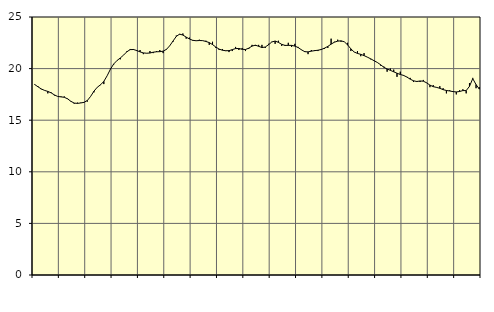
| Category | Piggar | Series 1 |
|---|---|---|
| nan | 18.5 | 18.46 |
| 87.0 | 18.3 | 18.24 |
| 87.0 | 18 | 18.03 |
| 87.0 | 17.9 | 17.89 |
| nan | 17.6 | 17.79 |
| 88.0 | 17.7 | 17.65 |
| 88.0 | 17.4 | 17.45 |
| 88.0 | 17.3 | 17.3 |
| nan | 17.3 | 17.26 |
| 89.0 | 17.3 | 17.22 |
| 89.0 | 17.1 | 17.07 |
| 89.0 | 16.8 | 16.83 |
| nan | 16.6 | 16.66 |
| 90.0 | 16.7 | 16.63 |
| 90.0 | 16.7 | 16.67 |
| 90.0 | 16.7 | 16.73 |
| nan | 16.8 | 16.91 |
| 91.0 | 17.3 | 17.31 |
| 91.0 | 17.7 | 17.81 |
| 91.0 | 18.2 | 18.19 |
| nan | 18.4 | 18.43 |
| 92.0 | 18.5 | 18.76 |
| 92.0 | 19.3 | 19.3 |
| 92.0 | 20 | 19.94 |
| nan | 20.4 | 20.45 |
| 93.0 | 20.8 | 20.78 |
| 93.0 | 20.9 | 21.03 |
| 93.0 | 21.3 | 21.31 |
| nan | 21.7 | 21.63 |
| 94.0 | 21.9 | 21.84 |
| 94.0 | 21.9 | 21.85 |
| 94.0 | 21.7 | 21.75 |
| nan | 21.8 | 21.62 |
| 95.0 | 21.4 | 21.52 |
| 95.0 | 21.5 | 21.49 |
| 95.0 | 21.7 | 21.51 |
| nan | 21.5 | 21.59 |
| 96.0 | 21.7 | 21.63 |
| 96.0 | 21.8 | 21.64 |
| 96.0 | 21.5 | 21.69 |
| nan | 21.9 | 21.86 |
| 97.0 | 22.2 | 22.21 |
| 97.0 | 22.6 | 22.67 |
| 97.0 | 23.2 | 23.12 |
| nan | 23.3 | 23.34 |
| 98.0 | 23.4 | 23.25 |
| 98.0 | 22.9 | 23.05 |
| 98.0 | 23 | 22.87 |
| nan | 22.7 | 22.74 |
| 99.0 | 22.7 | 22.7 |
| 99.0 | 22.8 | 22.72 |
| 99.0 | 22.7 | 22.71 |
| nan | 22.7 | 22.63 |
| 0.0 | 22.3 | 22.52 |
| 0.0 | 22.6 | 22.33 |
| 0.0 | 22 | 22.09 |
| nan | 21.8 | 21.89 |
| 1.0 | 21.9 | 21.78 |
| 1.0 | 21.7 | 21.73 |
| 1.0 | 21.6 | 21.74 |
| nan | 21.7 | 21.84 |
| 2.0 | 22.1 | 21.94 |
| 2.0 | 21.8 | 21.95 |
| 2.0 | 22 | 21.87 |
| nan | 21.7 | 21.85 |
| 3.0 | 21.9 | 21.98 |
| 3.0 | 22.3 | 22.18 |
| 3.0 | 22.2 | 22.27 |
| nan | 22.3 | 22.16 |
| 4.0 | 22.3 | 22.04 |
| 4.0 | 22 | 22.09 |
| 4.0 | 22.4 | 22.31 |
| nan | 22.6 | 22.58 |
| 5.0 | 22.4 | 22.67 |
| 5.0 | 22.7 | 22.54 |
| 5.0 | 22.2 | 22.35 |
| nan | 22.2 | 22.25 |
| 6.0 | 22.5 | 22.25 |
| 6.0 | 22.1 | 22.25 |
| 6.0 | 22.4 | 22.18 |
| nan | 22.1 | 22.04 |
| 7.0 | 21.8 | 21.82 |
| 7.0 | 21.7 | 21.64 |
| 7.0 | 21.4 | 21.62 |
| nan | 21.8 | 21.69 |
| 8.0 | 21.8 | 21.74 |
| 8.0 | 21.7 | 21.78 |
| 8.0 | 21.9 | 21.85 |
| nan | 21.9 | 21.98 |
| 9.0 | 22 | 22.15 |
| 9.0 | 22.9 | 22.37 |
| 9.0 | 22.6 | 22.56 |
| nan | 22.8 | 22.66 |
| 10.0 | 22.6 | 22.69 |
| 10.0 | 22.6 | 22.6 |
| 10.0 | 22.5 | 22.3 |
| nan | 21.7 | 21.91 |
| 11.0 | 21.6 | 21.61 |
| 11.0 | 21.7 | 21.47 |
| 11.0 | 21.2 | 21.38 |
| nan | 21.5 | 21.26 |
| 12.0 | 21.1 | 21.11 |
| 12.0 | 20.9 | 20.95 |
| 12.0 | 20.8 | 20.77 |
| nan | 20.6 | 20.6 |
| 13.0 | 20.3 | 20.38 |
| 13.0 | 20.2 | 20.13 |
| 13.0 | 19.7 | 19.96 |
| nan | 20 | 19.83 |
| 14.0 | 19.9 | 19.69 |
| 14.0 | 19.2 | 19.55 |
| 14.0 | 19.7 | 19.43 |
| nan | 19.3 | 19.34 |
| 15.0 | 19.2 | 19.18 |
| 15.0 | 19.1 | 18.98 |
| 15.0 | 18.7 | 18.82 |
| nan | 18.8 | 18.75 |
| 16.0 | 18.7 | 18.8 |
| 16.0 | 18.9 | 18.78 |
| 16.0 | 18.6 | 18.62 |
| nan | 18.2 | 18.4 |
| 17.0 | 18.4 | 18.25 |
| 17.0 | 18.2 | 18.18 |
| 17.0 | 18.3 | 18.09 |
| nan | 18.1 | 17.96 |
| 18.0 | 17.6 | 17.88 |
| 18.0 | 17.9 | 17.83 |
| 18.0 | 17.8 | 17.77 |
| nan | 17.5 | 17.74 |
| 19.0 | 17.9 | 17.78 |
| 19.0 | 18 | 17.87 |
| 19.0 | 17.6 | 17.87 |
| nan | 18.6 | 18.28 |
| 20.0 | 19.1 | 19.03 |
| 20.0 | 18.1 | 18.45 |
| 20.0 | 18.2 | 18.01 |